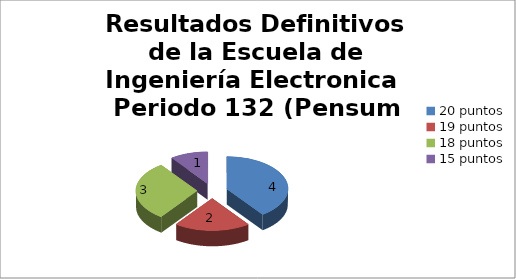
| Category | Series 0 |
|---|---|
| 20 puntos | 4 |
| 19 puntos | 2 |
| 18 puntos | 3 |
| 15 puntos | 1 |